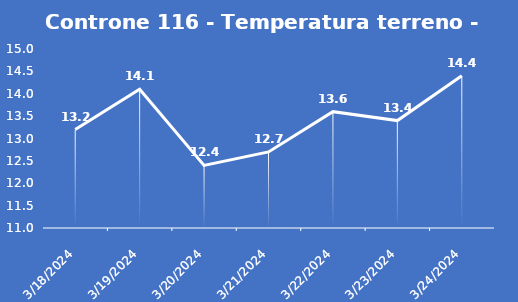
| Category | Controne 116 - Temperatura terreno - Grezzo (°C) |
|---|---|
| 3/18/24 | 13.2 |
| 3/19/24 | 14.1 |
| 3/20/24 | 12.4 |
| 3/21/24 | 12.7 |
| 3/22/24 | 13.6 |
| 3/23/24 | 13.4 |
| 3/24/24 | 14.4 |